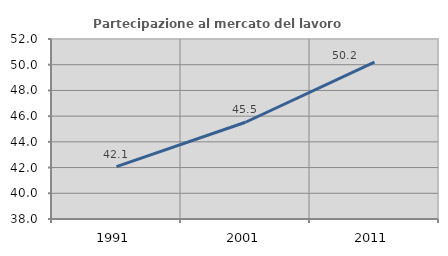
| Category | Partecipazione al mercato del lavoro  femminile |
|---|---|
| 1991.0 | 42.075 |
| 2001.0 | 45.524 |
| 2011.0 | 50.205 |